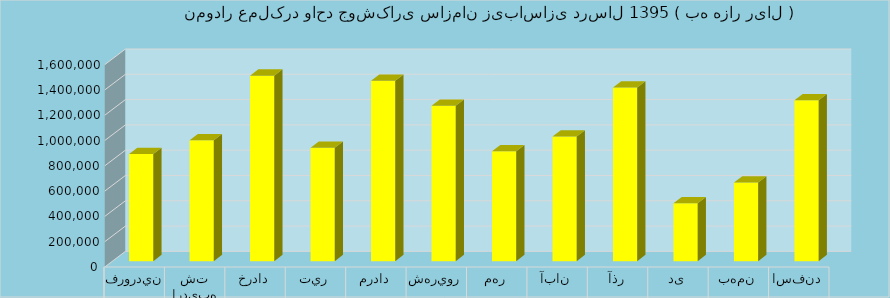
| Category | برآورد |
|---|---|
| فروردين | 846800 |
| ارديبهشت | 955100 |
| خرداد | 1466800 |
| تير | 895700 |
| مرداد | 1426100 |
| شهريور | 1228500 |
| مهر | 869000 |
| آبان | 984800 |
| آذر | 1372100 |
| دی | 457999 |
| بهمن | 622500 |
| اسفند | 1272000 |